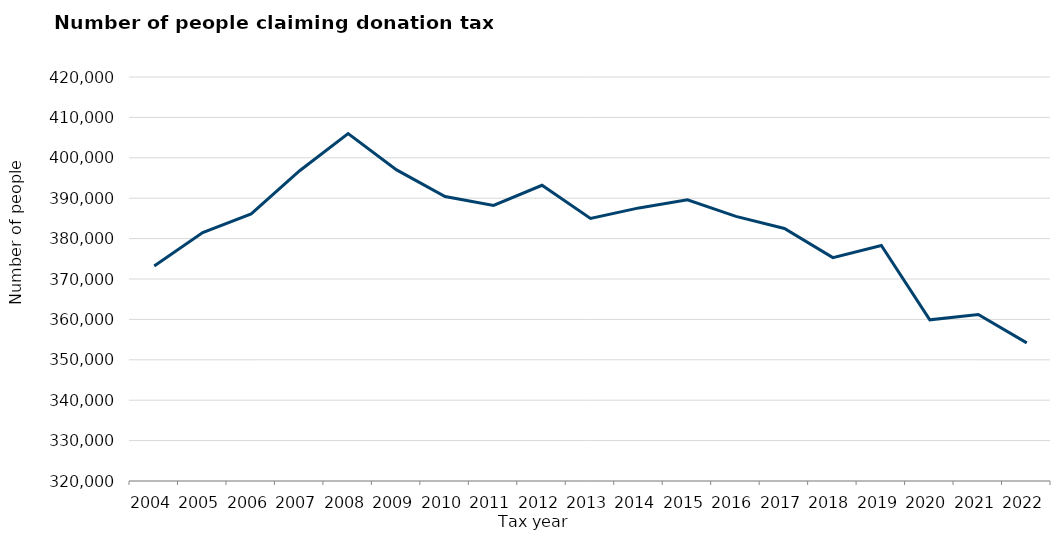
| Category | Series 0 |
|---|---|
| 2004.0 | 373200 |
| 2005.0 | 381500 |
| 2006.0 | 386100 |
| 2007.0 | 396800 |
| 2008.0 | 406000 |
| 2009.0 | 397000 |
| 2010.0 | 390400 |
| 2011.0 | 388200 |
| 2012.0 | 393200 |
| 2013.0 | 385000 |
| 2014.0 | 387600 |
| 2015.0 | 389600 |
| 2016.0 | 385500 |
| 2017.0 | 382500 |
| 2018.0 | 375300 |
| 2019.0 | 378300 |
| 2020.0 | 359900 |
| 2021.0 | 361200 |
| 2022.0 | 354200 |